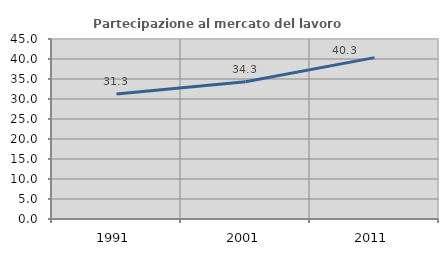
| Category | Partecipazione al mercato del lavoro  femminile |
|---|---|
| 1991.0 | 31.25 |
| 2001.0 | 34.295 |
| 2011.0 | 40.345 |